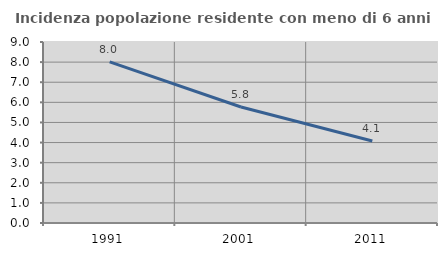
| Category | Incidenza popolazione residente con meno di 6 anni |
|---|---|
| 1991.0 | 8.008 |
| 2001.0 | 5.768 |
| 2011.0 | 4.074 |